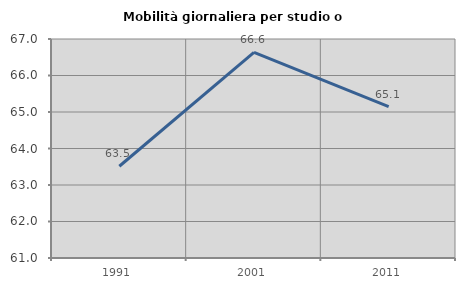
| Category | Mobilità giornaliera per studio o lavoro |
|---|---|
| 1991.0 | 63.514 |
| 2001.0 | 66.635 |
| 2011.0 | 65.147 |